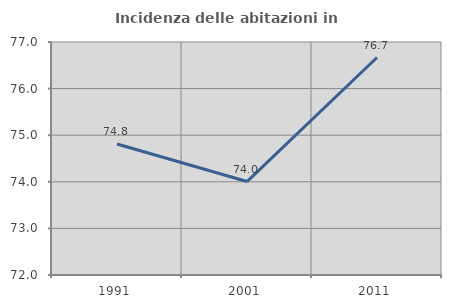
| Category | Incidenza delle abitazioni in proprietà  |
|---|---|
| 1991.0 | 74.812 |
| 2001.0 | 74.005 |
| 2011.0 | 76.667 |